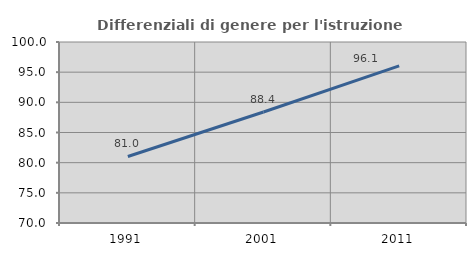
| Category | Differenziali di genere per l'istruzione superiore |
|---|---|
| 1991.0 | 81.03 |
| 2001.0 | 88.404 |
| 2011.0 | 96.056 |